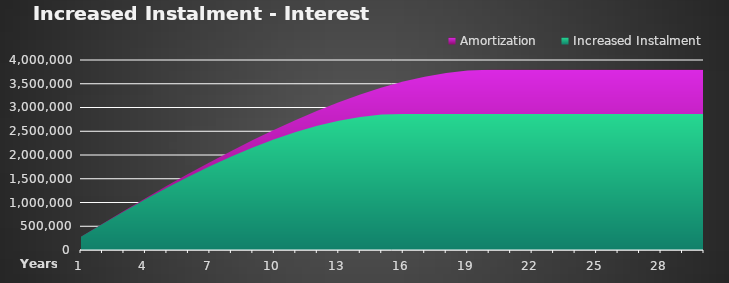
| Category | Amortization |  Increased Instalment  |
|---|---|---|
| 0 | 279466.095 | 278189.095 |
| 1 | 554748.367 | 549199.398 |
| 2 | 825351.092 | 812180.323 |
| 3 | 1090719.811 | 1066180.503 |
| 4 | 1350234.365 | 1310135.846 |
| 5 | 1603201.121 | 1542856.178 |
| 6 | 1848844.255 | 1763010.31 |
| 7 | 2086296.021 | 1969109.323 |
| 8 | 2314585.858 | 2159487.884 |
| 9 | 2532628.205 | 2332283.34 |
| 10 | 2739208.879 | 2485412.34 |
| 11 | 2932969.833 | 2616544.686 |
| 12 | 3112392.111 | 2723074.084 |
| 13 | 3275776.782 | 2802085.43 |
| 14 | 3421223.613 | 2850318.222 |
| 15 | 3546607.223 | 2864386.364 |
| 16 | 3649550.404 | 2864386.364 |
| 17 | 3727394.278 | 2864386.364 |
| 18 | 3777164.933 | 2864386.364 |
| 19 | 3795536.086 | 2864386.364 |
| 20 | 3795536.086 | 2864386.364 |
| 21 | 3795536.086 | 2864386.364 |
| 22 | 3795536.086 | 2864386.364 |
| 23 | 3795536.086 | 2864386.364 |
| 24 | 3795536.086 | 2864386.364 |
| 25 | 3795536.086 | 2864386.364 |
| 26 | 3795536.086 | 2864386.364 |
| 27 | 3795536.086 | 2864386.364 |
| 28 | 3795536.086 | 2864386.364 |
| 29 | 3795536.086 | 2864386.364 |